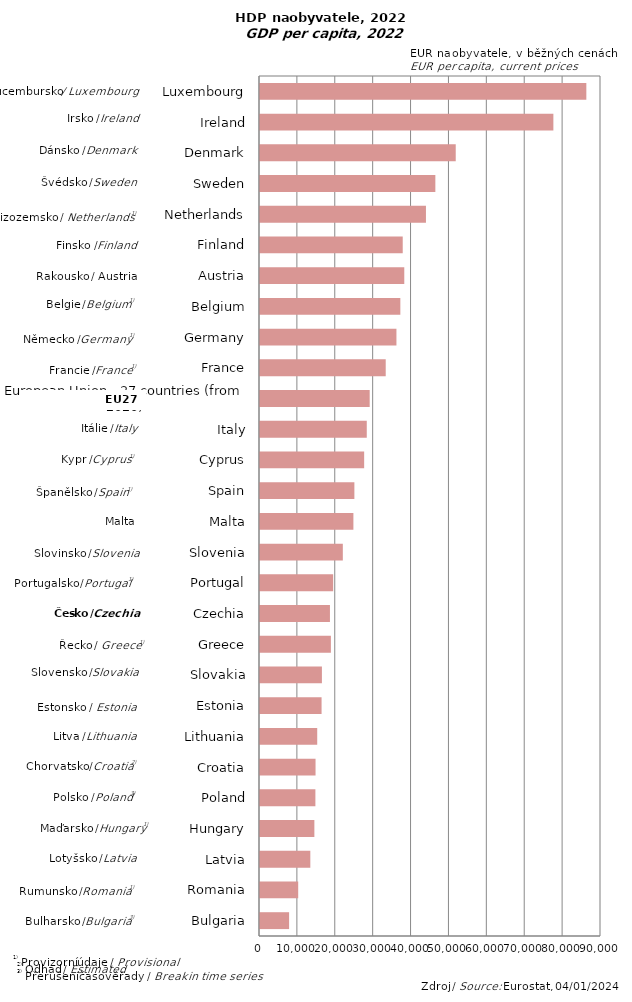
| Category | Series 0 |
|---|---|
| Bulgaria | 7680 |
| Romania | 10080 |
| Latvia | 13280 |
| Hungary | 14350 |
| Poland | 14620 |
| Croatia | 14660 |
| Lithuania | 15100 |
| Estonia | 16250 |
| Slovakia | 16340 |
| Greece | 18710 |
| Czechia | 18460 |
| Portugal | 19310 |
| Slovenia | 21860 |
| Malta | 24650 |
| Spain | 24910 |
| Cyprus | 27490 |
| Italy | 28180 |
| European Union - 27 countries (from 2020) | 28950 |
| France | 33180 |
| Germany | 36010 |
| Belgium | 37040 |
| Austria | 38080 |
| Finland | 37670 |
| Netherlands | 43800 |
| Sweden | 46280 |
| Denmark | 51660 |
| Ireland | 77430 |
| Luxembourg | 86130 |